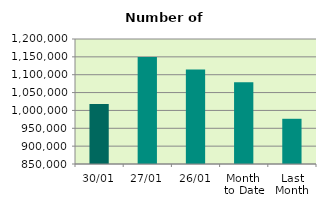
| Category | Series 0 |
|---|---|
| 30/01 | 1017704 |
| 27/01 | 1149866 |
| 26/01 | 1114524 |
| Month 
to Date | 1078584.762 |
| Last
Month | 976608.095 |